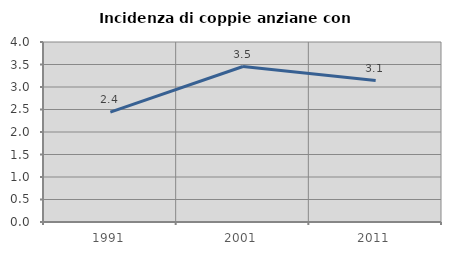
| Category | Incidenza di coppie anziane con figli |
|---|---|
| 1991.0 | 2.443 |
| 2001.0 | 3.455 |
| 2011.0 | 3.143 |